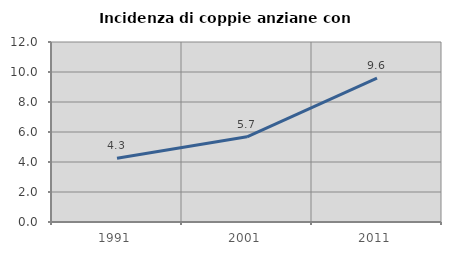
| Category | Incidenza di coppie anziane con figli |
|---|---|
| 1991.0 | 4.255 |
| 2001.0 | 5.682 |
| 2011.0 | 9.589 |